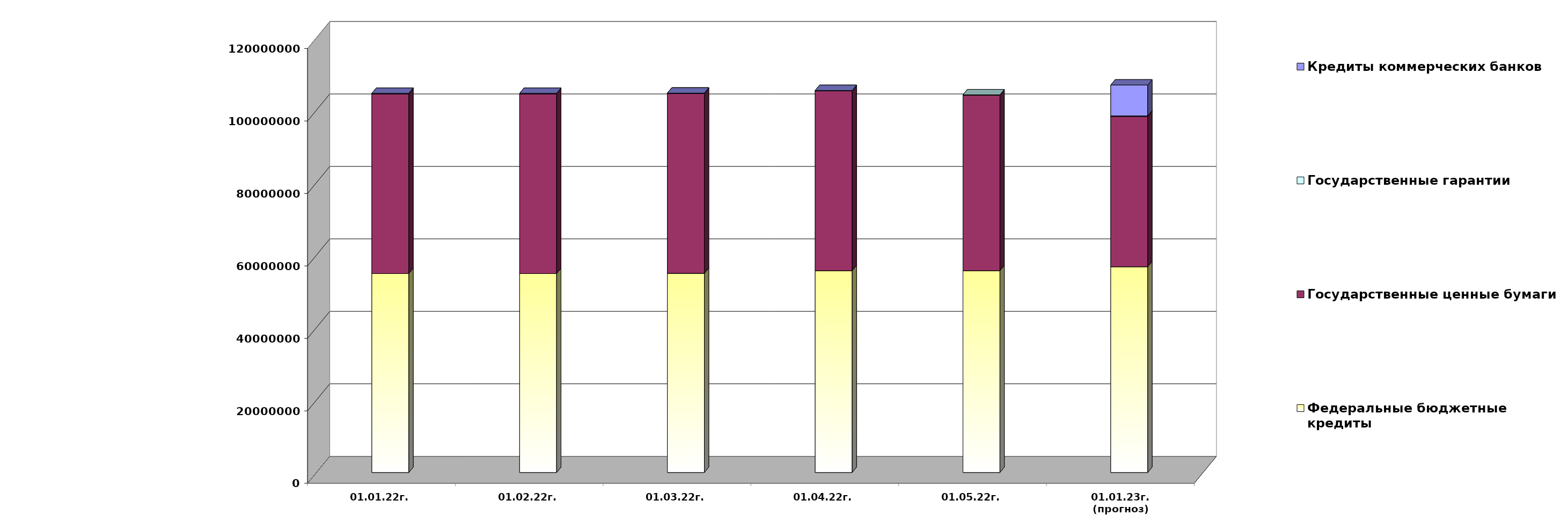
| Category | Федеральные бюджетные кредиты | Государственные ценные бумаги  | Государственные гарантии | Кредиты коммерческих банков |
|---|---|---|---|---|
| 01.01.22г. | 54900618.713 | 49600000 | 141570.67 | 0 |
| 01.02.22г. | 54900618.713 | 49600000 | 139748.87 | 0 |
| 01.03.22г. | 54970753.113 | 49600000 | 139748.87 | 0 |
| 01.04.22г. | 55700753.113 | 49600000 | 139748.87 | 0 |
| 01.05.22г. | 55700753.113 | 48400000 | 138270.964 | 0 |
| 01.01.23г.
(прогноз) | 56784668.3 | 41500000 | 129957.7 | 8538072.1 |